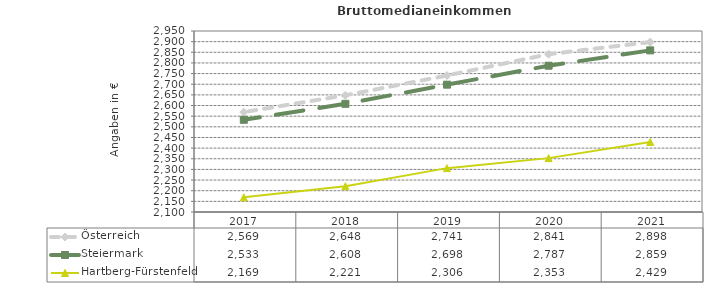
| Category | Österreich | Steiermark | Hartberg-Fürstenfeld |
|---|---|---|---|
| 2021.0 | 2898 | 2859 | 2429 |
| 2020.0 | 2841 | 2787 | 2353 |
| 2019.0 | 2741 | 2698 | 2306 |
| 2018.0 | 2648 | 2608 | 2221 |
| 2017.0 | 2569 | 2533 | 2169 |